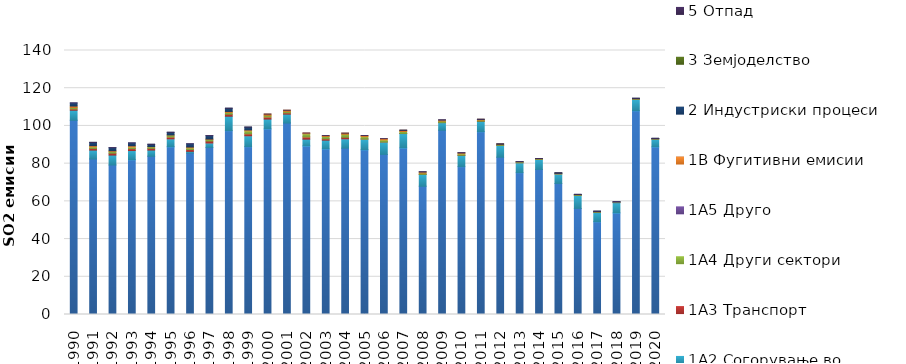
| Category | 1A1 | 1A2 | 1A3 | 1A4 | 1A5 | 1B | 2 | 3 | 5 |
|---|---|---|---|---|---|---|---|---|---|
| 1990.0 | 102.964 | 5.36 | 0.733 | 0.716 | 0 | 0.759 | 1.651 | 0 | 0.002 |
| 1991.0 | 82.44 | 4.741 | 0.881 | 0.876 | 0 | 0.6 | 1.738 | 0 | 0.002 |
| 1992.0 | 79.265 | 5.282 | 0.996 | 0.958 | 0 | 0.353 | 1.617 | 0 | 0.002 |
| 1993.0 | 82.029 | 4.915 | 1.031 | 0.86 | 0 | 0.634 | 1.51 | 0 | 0.002 |
| 1994.0 | 83.897 | 3.29 | 0.908 | 0.846 | 0 | 0.089 | 1.226 | 0 | 0.002 |
| 1995.0 | 88.919 | 4.229 | 1.006 | 0.992 | 0 | 0.074 | 1.405 | 0 | 0.002 |
| 1996.0 | 85.585 | 0.923 | 1.008 | 0.867 | 0 | 0.434 | 1.693 | 0 | 0.002 |
| 1997.0 | 88.622 | 2.33 | 1.033 | 0.843 | 0 | 0.237 | 1.786 | 0 | 0.002 |
| 1998.0 | 97.487 | 7.66 | 1.048 | 1.002 | 0 | 0.47 | 1.715 | 0 | 0.002 |
| 1999.0 | 88.995 | 5.778 | 1.06 | 1.564 | 0 | 0.477 | 1.492 | 0 | 0.002 |
| 2000.0 | 98.407 | 5.231 | 1.097 | 0.892 | 0 | 0.65 | 0 | 0 | 0.002 |
| 2001.0 | 101.534 | 4.719 | 0.73 | 0.713 | 0 | 0.631 | 0 | 0 | 0.002 |
| 2002.0 | 89.359 | 3.625 | 1.18 | 1.685 | 0 | 0.404 | 0 | 0 | 0.002 |
| 2003.0 | 87.799 | 4.65 | 0.751 | 1.196 | 0 | 0.488 | 0 | 0 | 0.002 |
| 2004.0 | 88.21 | 4.976 | 0.775 | 1.602 | 0 | 0.608 | 0 | 0 | 0.002 |
| 2005.0 | 87.326 | 5.703 | 0.051 | 1.236 | 0 | 0.59 | 0 | 0 | 0.002 |
| 2006.0 | 84.898 | 6.574 | 0.06 | 1.07 | 0 | 0.665 | 0 | 0 | 0.002 |
| 2007.0 | 88.331 | 7.627 | 0.039 | 1.057 | 0 | 0.654 | 0 | 0 | 0.002 |
| 2008.0 | 67.987 | 6.273 | 0.04 | 0.691 | 0 | 0.661 | 0 | 0 | 0.002 |
| 2009.0 | 97.699 | 4.043 | 0.033 | 0.8 | 0 | 0.606 | 0 | 0 | 0.002 |
| 2010.0 | 78.409 | 6.002 | 0.032 | 0.785 | 0 | 0.531 | 0 | 0 | 0.002 |
| 2011.0 | 96.929 | 5.542 | 0.031 | 0.575 | 0 | 0.439 | 0 | 0 | 0.002 |
| 2012.0 | 83.406 | 6.247 | 0.03 | 0.561 | 0 | 0.162 | 0 | 0 | 0.002 |
| 2013.0 | 75.213 | 5.262 | 0.033 | 0.495 | 0 | 0.037 | 0 | 0 | 0.002 |
| 2014.0 | 76.953 | 5.31 | 0.036 | 0.411 | 0 | 0.005 | 0 | 0 | 0.002 |
| 2015.0 | 69.507 | 5.025 | 0.032 | 0.453 | 0 | 0 | 0.013 | 0 | 0.002 |
| 2016.0 | 56.267 | 6.887 | 0.043 | 0.464 | 0 | 0 | 0.033 | 0 | 0.002 |
| 2017.0 | 49.188 | 5.043 | 0.045 | 0.426 | 0 | 0 | 0.054 | 0 | 0.002 |
| 2018.0 | 53.855 | 5.467 | 0.047 | 0.387 | 0 | 0 | 0.069 | 0 | 0.003 |
| 2019.0 | 108.035 | 6.074 | 0.052 | 0.421 | 0 | 0 | 0.07 | 0 | 0.003 |
| 2020.0 | 88.868 | 4.123 | 0.029 | 0.332 | 0 | 0 | 0.063 | 0 | 0.003 |